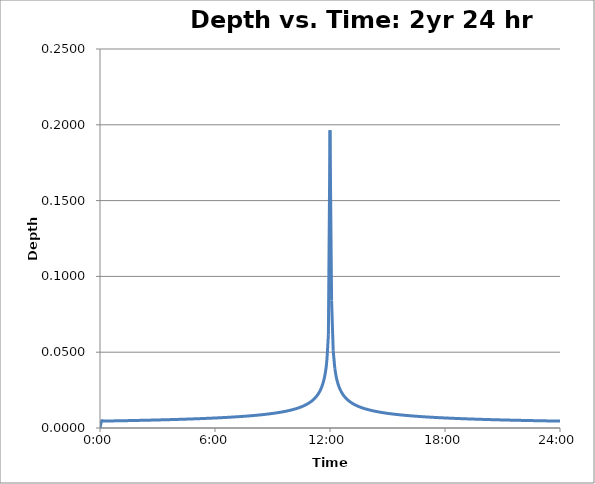
| Category | 2yr 24hr Depths |
|---|---|
| 0.0 | 0 |
| 0.003472222222222222 | 0.005 |
| 0.006944444444444444 | 0.005 |
| 0.0104166666666667 | 0.005 |
| 0.0138888888888889 | 0.005 |
| 0.0173611111111111 | 0.005 |
| 0.0208333333333333 | 0.005 |
| 0.0243055555555556 | 0.005 |
| 0.0277777777777778 | 0.005 |
| 0.03125 | 0.005 |
| 0.0347222222222222 | 0.005 |
| 0.0381944444444444 | 0.005 |
| 0.0416666666666667 | 0.005 |
| 0.0451388888888889 | 0.005 |
| 0.0486111111111111 | 0.005 |
| 0.0520833333333333 | 0.005 |
| 0.0555555555555556 | 0.005 |
| 0.0590277777777778 | 0.005 |
| 0.0625 | 0.005 |
| 0.0659722222222222 | 0.005 |
| 0.0694444444444444 | 0.005 |
| 0.0729166666666667 | 0.005 |
| 0.0763888888888889 | 0.005 |
| 0.0798611111111111 | 0.005 |
| 0.0833333333333333 | 0.005 |
| 0.0868055555555556 | 0.005 |
| 0.0902777777777778 | 0.005 |
| 0.09375 | 0.005 |
| 0.0972222222222222 | 0.005 |
| 0.100694444444444 | 0.005 |
| 0.104166666666667 | 0.005 |
| 0.107638888888889 | 0.005 |
| 0.111111111111111 | 0.005 |
| 0.114583333333333 | 0.005 |
| 0.118055555555556 | 0.005 |
| 0.121527777777778 | 0.005 |
| 0.125 | 0.005 |
| 0.128472222222222 | 0.005 |
| 0.131944444444444 | 0.005 |
| 0.135416666666667 | 0.005 |
| 0.138888888888889 | 0.005 |
| 0.142361111111111 | 0.005 |
| 0.145833333333333 | 0.005 |
| 0.149305555555556 | 0.006 |
| 0.152777777777778 | 0.006 |
| 0.15625 | 0.006 |
| 0.159722222222222 | 0.006 |
| 0.163194444444444 | 0.006 |
| 0.166666666666667 | 0.006 |
| 0.170138888888889 | 0.006 |
| 0.173611111111111 | 0.006 |
| 0.177083333333333 | 0.006 |
| 0.180555555555556 | 0.006 |
| 0.184027777777778 | 0.006 |
| 0.1875 | 0.006 |
| 0.190972222222222 | 0.006 |
| 0.194444444444444 | 0.006 |
| 0.197916666666667 | 0.006 |
| 0.201388888888889 | 0.006 |
| 0.204861111111111 | 0.006 |
| 0.208333333333333 | 0.006 |
| 0.211805555555556 | 0.006 |
| 0.215277777777778 | 0.006 |
| 0.21875 | 0.006 |
| 0.222222222222222 | 0.006 |
| 0.225694444444444 | 0.006 |
| 0.229166666666667 | 0.006 |
| 0.232638888888889 | 0.006 |
| 0.236111111111111 | 0.006 |
| 0.239583333333333 | 0.006 |
| 0.243055555555556 | 0.007 |
| 0.246527777777778 | 0.007 |
| 0.25 | 0.007 |
| 0.253472222222222 | 0.007 |
| 0.256944444444444 | 0.007 |
| 0.260416666666667 | 0.007 |
| 0.263888888888889 | 0.007 |
| 0.267361111111111 | 0.007 |
| 0.270833333333333 | 0.007 |
| 0.274305555555556 | 0.007 |
| 0.277777777777778 | 0.007 |
| 0.28125 | 0.007 |
| 0.284722222222222 | 0.007 |
| 0.288194444444444 | 0.007 |
| 0.291666666666667 | 0.007 |
| 0.295138888888889 | 0.007 |
| 0.298611111111111 | 0.007 |
| 0.302083333333333 | 0.007 |
| 0.305555555555556 | 0.008 |
| 0.309027777777778 | 0.008 |
| 0.3125 | 0.008 |
| 0.315972222222222 | 0.008 |
| 0.319444444444444 | 0.008 |
| 0.322916666666667 | 0.008 |
| 0.326388888888889 | 0.008 |
| 0.329861111111111 | 0.008 |
| 0.333333333333333 | 0.008 |
| 0.336805555555556 | 0.008 |
| 0.340277777777778 | 0.008 |
| 0.34375 | 0.009 |
| 0.347222222222222 | 0.009 |
| 0.350694444444444 | 0.009 |
| 0.354166666666667 | 0.009 |
| 0.357638888888889 | 0.009 |
| 0.361111111111111 | 0.009 |
| 0.364583333333333 | 0.009 |
| 0.368055555555556 | 0.009 |
| 0.371527777777778 | 0.009 |
| 0.375 | 0.01 |
| 0.378472222222222 | 0.01 |
| 0.381944444444444 | 0.01 |
| 0.385416666666667 | 0.01 |
| 0.388888888888889 | 0.01 |
| 0.392361111111111 | 0.01 |
| 0.395833333333333 | 0.011 |
| 0.399305555555556 | 0.011 |
| 0.402777777777778 | 0.011 |
| 0.40625 | 0.011 |
| 0.409722222222222 | 0.011 |
| 0.413194444444444 | 0.012 |
| 0.416666666666667 | 0.012 |
| 0.420138888888889 | 0.012 |
| 0.423611111111111 | 0.013 |
| 0.427083333333333 | 0.013 |
| 0.430555555555556 | 0.013 |
| 0.434027777777778 | 0.014 |
| 0.4375 | 0.014 |
| 0.440972222222222 | 0.014 |
| 0.444444444444444 | 0.015 |
| 0.447916666666667 | 0.015 |
| 0.451388888888889 | 0.016 |
| 0.454861111111111 | 0.017 |
| 0.458333333333333 | 0.017 |
| 0.461805555555556 | 0.018 |
| 0.465277777777778 | 0.019 |
| 0.46875 | 0.02 |
| 0.472222222222222 | 0.022 |
| 0.475694444444444 | 0.023 |
| 0.479166666666667 | 0.025 |
| 0.482638888888889 | 0.028 |
| 0.486111111111111 | 0.031 |
| 0.489583333333333 | 0.036 |
| 0.493055555555556 | 0.044 |
| 0.496527777777778 | 0.062 |
| 0.5 | 0.196 |
| 0.503472222222222 | 0.084 |
| 0.506944444444444 | 0.051 |
| 0.510416666666667 | 0.039 |
| 0.513888888888889 | 0.033 |
| 0.517361111111111 | 0.029 |
| 0.520833333333333 | 0.026 |
| 0.524305555555556 | 0.024 |
| 0.527777777777778 | 0.022 |
| 0.53125 | 0.021 |
| 0.534722222222222 | 0.02 |
| 0.538194444444444 | 0.019 |
| 0.541666666666667 | 0.018 |
| 0.545138888888889 | 0.017 |
| 0.548611111111111 | 0.016 |
| 0.552083333333333 | 0.016 |
| 0.555555555555556 | 0.015 |
| 0.559027777777778 | 0.015 |
| 0.5625 | 0.014 |
| 0.565972222222222 | 0.014 |
| 0.569444444444444 | 0.013 |
| 0.572916666666667 | 0.013 |
| 0.576388888888889 | 0.013 |
| 0.579861111111111 | 0.012 |
| 0.583333333333333 | 0.012 |
| 0.586805555555555 | 0.012 |
| 0.590277777777778 | 0.012 |
| 0.59375 | 0.011 |
| 0.597222222222222 | 0.011 |
| 0.600694444444444 | 0.011 |
| 0.604166666666667 | 0.011 |
| 0.607638888888889 | 0.01 |
| 0.611111111111111 | 0.01 |
| 0.614583333333333 | 0.01 |
| 0.618055555555555 | 0.01 |
| 0.621527777777778 | 0.01 |
| 0.625 | 0.01 |
| 0.628472222222222 | 0.01 |
| 0.631944444444444 | 0.009 |
| 0.635416666666667 | 0.009 |
| 0.638888888888889 | 0.009 |
| 0.642361111111111 | 0.009 |
| 0.645833333333333 | 0.009 |
| 0.649305555555555 | 0.009 |
| 0.652777777777778 | 0.009 |
| 0.65625 | 0.009 |
| 0.659722222222222 | 0.008 |
| 0.663194444444444 | 0.008 |
| 0.666666666666667 | 0.008 |
| 0.670138888888889 | 0.008 |
| 0.673611111111111 | 0.008 |
| 0.677083333333333 | 0.008 |
| 0.680555555555555 | 0.008 |
| 0.684027777777778 | 0.008 |
| 0.6875 | 0.008 |
| 0.690972222222222 | 0.008 |
| 0.694444444444444 | 0.008 |
| 0.697916666666667 | 0.008 |
| 0.701388888888889 | 0.007 |
| 0.704861111111111 | 0.007 |
| 0.708333333333333 | 0.007 |
| 0.711805555555555 | 0.007 |
| 0.715277777777778 | 0.007 |
| 0.71875 | 0.007 |
| 0.722222222222222 | 0.007 |
| 0.725694444444444 | 0.007 |
| 0.729166666666667 | 0.007 |
| 0.732638888888889 | 0.007 |
| 0.736111111111111 | 0.007 |
| 0.739583333333333 | 0.007 |
| 0.743055555555555 | 0.007 |
| 0.746527777777778 | 0.007 |
| 0.75 | 0.007 |
| 0.753472222222222 | 0.007 |
| 0.756944444444444 | 0.007 |
| 0.760416666666667 | 0.006 |
| 0.763888888888889 | 0.006 |
| 0.767361111111111 | 0.006 |
| 0.770833333333333 | 0.006 |
| 0.774305555555555 | 0.006 |
| 0.777777777777778 | 0.006 |
| 0.78125 | 0.006 |
| 0.784722222222222 | 0.006 |
| 0.788194444444444 | 0.006 |
| 0.791666666666667 | 0.006 |
| 0.795138888888889 | 0.006 |
| 0.798611111111111 | 0.006 |
| 0.802083333333333 | 0.006 |
| 0.805555555555555 | 0.006 |
| 0.809027777777778 | 0.006 |
| 0.8125 | 0.006 |
| 0.815972222222222 | 0.006 |
| 0.819444444444444 | 0.006 |
| 0.822916666666667 | 0.006 |
| 0.826388888888889 | 0.006 |
| 0.829861111111111 | 0.006 |
| 0.833333333333333 | 0.006 |
| 0.836805555555555 | 0.006 |
| 0.840277777777778 | 0.006 |
| 0.84375 | 0.006 |
| 0.847222222222222 | 0.006 |
| 0.850694444444444 | 0.006 |
| 0.854166666666667 | 0.005 |
| 0.857638888888889 | 0.005 |
| 0.861111111111111 | 0.005 |
| 0.864583333333333 | 0.005 |
| 0.868055555555555 | 0.005 |
| 0.871527777777778 | 0.005 |
| 0.875 | 0.005 |
| 0.878472222222222 | 0.005 |
| 0.881944444444444 | 0.005 |
| 0.885416666666667 | 0.005 |
| 0.888888888888889 | 0.005 |
| 0.892361111111111 | 0.005 |
| 0.895833333333333 | 0.005 |
| 0.899305555555555 | 0.005 |
| 0.902777777777778 | 0.005 |
| 0.90625 | 0.005 |
| 0.909722222222222 | 0.005 |
| 0.913194444444444 | 0.005 |
| 0.916666666666667 | 0.005 |
| 0.920138888888889 | 0.005 |
| 0.923611111111111 | 0.005 |
| 0.927083333333333 | 0.005 |
| 0.930555555555555 | 0.005 |
| 0.934027777777778 | 0.005 |
| 0.9375 | 0.005 |
| 0.940972222222222 | 0.005 |
| 0.944444444444444 | 0.005 |
| 0.947916666666667 | 0.005 |
| 0.951388888888889 | 0.005 |
| 0.954861111111111 | 0.005 |
| 0.958333333333333 | 0.005 |
| 0.961805555555555 | 0.005 |
| 0.965277777777778 | 0.005 |
| 0.96875 | 0.005 |
| 0.972222222222222 | 0.005 |
| 0.975694444444444 | 0.005 |
| 0.979166666666667 | 0.005 |
| 0.982638888888889 | 0.005 |
| 0.986111111111111 | 0.005 |
| 0.989583333333333 | 0.005 |
| 0.993055555555555 | 0.005 |
| 0.996527777777778 | 0.005 |
| 1.0 | 0.005 |